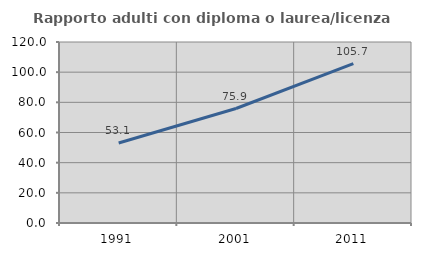
| Category | Rapporto adulti con diploma o laurea/licenza media  |
|---|---|
| 1991.0 | 53.059 |
| 2001.0 | 75.907 |
| 2011.0 | 105.713 |